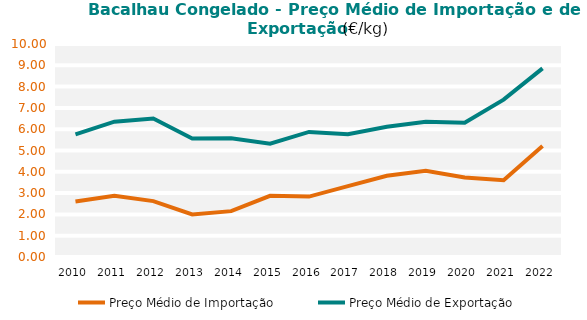
| Category | Preço Médio de Importação | Preço Médio de Exportação |
|---|---|---|
| 2010.0 | 2.604 | 5.758 |
| 2011.0 | 2.87 | 6.353 |
| 2012.0 | 2.623 | 6.503 |
| 2013.0 | 2.001 | 5.564 |
| 2014.0 | 2.152 | 5.575 |
| 2015.0 | 2.874 | 5.319 |
| 2016.0 | 2.835 | 5.872 |
| 2017.0 | 3.326 | 5.768 |
| 2018.0 | 3.811 | 6.118 |
| 2019.0 | 4.048 | 6.352 |
| 2020.0 | 3.728 | 6.302 |
| 2021.0 | 3.605 | 7.388 |
| 2022.0 | 5.21 | 8.856 |